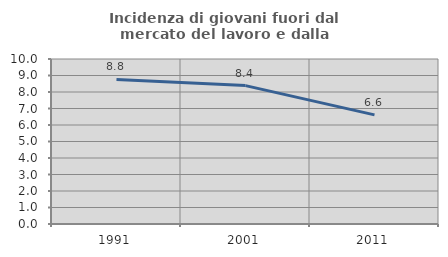
| Category | Incidenza di giovani fuori dal mercato del lavoro e dalla formazione  |
|---|---|
| 1991.0 | 8.759 |
| 2001.0 | 8.387 |
| 2011.0 | 6.612 |